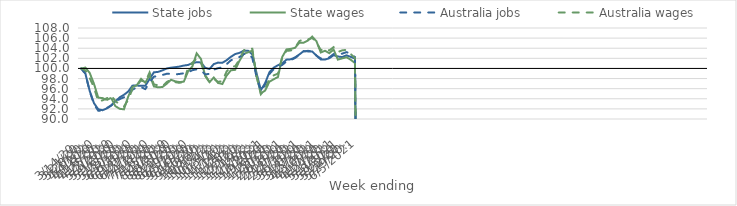
| Category | State jobs | State wages | Australia jobs | Australia wages |
|---|---|---|---|---|
| 14/03/2020 | 100 | 100 | 100 | 100 |
| 21/03/2020 | 98.973 | 100.165 | 98.972 | 99.605 |
| 28/03/2020 | 95.551 | 99.113 | 95.467 | 98.106 |
| 04/04/2020 | 93.128 | 96.958 | 92.921 | 96.238 |
| 11/04/2020 | 91.926 | 94.223 | 91.648 | 93.491 |
| 18/04/2020 | 91.739 | 94.139 | 91.631 | 93.694 |
| 25/04/2020 | 92.091 | 93.749 | 92.161 | 94.113 |
| 02/05/2020 | 92.668 | 94.19 | 92.658 | 94.66 |
| 09/05/2020 | 93.484 | 92.546 | 93.343 | 93.583 |
| 16/05/2020 | 94.279 | 92.021 | 93.936 | 92.817 |
| 23/05/2020 | 94.782 | 91.911 | 94.294 | 92.471 |
| 30/05/2020 | 95.434 | 94.436 | 94.802 | 93.799 |
| 06/06/2020 | 96.601 | 96.304 | 95.786 | 95.975 |
| 13/06/2020 | 96.61 | 96.678 | 96.286 | 96.648 |
| 20/06/2020 | 96.58 | 97.934 | 96.302 | 97.605 |
| 27/06/2020 | 96.565 | 97.185 | 95.914 | 97.364 |
| 04/07/2020 | 97.915 | 98.695 | 97.234 | 99.209 |
| 11/07/2020 | 99.232 | 96.444 | 98.377 | 96.842 |
| 18/07/2020 | 99.325 | 96.265 | 98.483 | 96.672 |
| 25/07/2020 | 99.619 | 96.33 | 98.707 | 96.464 |
| 01/08/2020 | 99.988 | 96.973 | 98.939 | 97.319 |
| 08/08/2020 | 100.151 | 97.761 | 98.937 | 97.774 |
| 15/08/2020 | 100.248 | 97.452 | 98.822 | 97.284 |
| 22/08/2020 | 100.374 | 97.298 | 98.911 | 97.15 |
| 29/08/2020 | 100.573 | 97.398 | 99.048 | 97.377 |
| 05/09/2020 | 100.689 | 99.422 | 99.236 | 100.159 |
| 12/09/2020 | 101.049 | 100.407 | 99.656 | 101.158 |
| 19/09/2020 | 101.238 | 102.985 | 99.825 | 101.963 |
| 26/09/2020 | 101.187 | 101.878 | 99.625 | 101.122 |
| 03/10/2020 | 100.124 | 98.479 | 98.824 | 98.703 |
| 10/10/2020 | 99.887 | 97.284 | 98.93 | 97.286 |
| 17/10/2020 | 100.86 | 98.203 | 99.758 | 97.926 |
| 24/10/2020 | 101.155 | 97.126 | 100.051 | 97.346 |
| 31/10/2020 | 101.117 | 96.924 | 100.234 | 97.513 |
| 07/11/2020 | 101.63 | 98.577 | 100.843 | 99.39 |
| 14/11/2020 | 102.304 | 99.636 | 101.614 | 100.362 |
| 21/11/2020 | 102.846 | 99.73 | 101.941 | 100.423 |
| 28/11/2020 | 103.081 | 101.504 | 102.262 | 101.777 |
| 05/12/2020 | 103.515 | 102.903 | 102.828 | 103.567 |
| 12/12/2020 | 103.515 | 103.186 | 102.902 | 104.028 |
| 19/12/2020 | 102.779 | 103.522 | 102.101 | 103.902 |
| 26/12/2020 | 99.03 | 98.506 | 98.307 | 98.441 |
| 02/01/2021 | 95.721 | 95.065 | 95.41 | 94.903 |
| 09/01/2021 | 97.092 | 95.63 | 96.79 | 95.912 |
| 16/01/2021 | 99.246 | 97.368 | 98.893 | 97.958 |
| 23/01/2021 | 100.148 | 97.865 | 99.862 | 98.634 |
| 30/01/2021 | 100.643 | 98.3 | 100.346 | 98.978 |
| 06/02/2021 | 101.006 | 102.274 | 100.698 | 102.329 |
| 13/02/2021 | 101.744 | 103.773 | 101.406 | 103.465 |
| 20/02/2021 | 101.804 | 103.874 | 101.644 | 103.55 |
| 27/02/2021 | 102.184 | 104.083 | 102.078 | 104.122 |
| 06/03/2021 | 102.769 | 105.104 | 102.697 | 105.405 |
| 13/03/2021 | 103.43 | 105.104 | 103.369 | 105.802 |
| 20/03/2021 | 103.368 | 105.508 | 103.483 | 105.731 |
| 27/03/2021 | 103.351 | 106.3 | 103.4 | 106.023 |
| 03/04/2021 | 102.547 | 105.368 | 102.51 | 105.184 |
| 10/04/2021 | 101.774 | 103.157 | 101.979 | 103.615 |
| 17/04/2021 | 101.768 | 103.498 | 101.926 | 103.956 |
| 24/04/2021 | 102.014 | 103.015 | 102.186 | 103.563 |
| 01/05/2021 | 102.624 | 103.733 | 102.848 | 104.217 |
| 08/05/2021 | 102.368 | 101.75 | 102.834 | 103.251 |
| 15/05/2021 | 102.25 | 101.987 | 102.922 | 103.573 |
| 22/05/2021 | 102.591 | 102.219 | 103.224 | 103.677 |
| 29/05/2021 | 102.296 | 101.725 | 102.941 | 102.856 |
| 05/06/2021 | 101.966 | 101.056 | 102.252 | 102.059 |